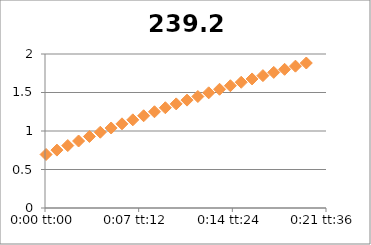
| Category | 239.2 |
|---|---|
| 5.78703703703704e-05 | 0.695 |
| 0.000636574074074074 | 0.752 |
| 0.00121527777777778 | 0.811 |
| 0.00179398148148148 | 0.87 |
| 0.00237268518518518 | 0.929 |
| 0.00295138888888889 | 0.984 |
| 0.00353009259259259 | 1.039 |
| 0.0041087962962963 | 1.093 |
| 0.0046875 | 1.145 |
| 0.0052662037037037 | 1.198 |
| 0.00584490740740741 | 1.25 |
| 0.00642361111111111 | 1.302 |
| 0.00700231481481481 | 1.352 |
| 0.00758101851851852 | 1.401 |
| 0.00815972222222222 | 1.448 |
| 0.00873842592592592 | 1.496 |
| 0.00931712962962963 | 1.542 |
| 0.00989583333333333 | 1.588 |
| 0.010474537037037 | 1.633 |
| 0.0110532407407407 | 1.676 |
| 0.0116319444444444 | 1.719 |
| 0.0122106481481481 | 1.761 |
| 0.0127893518518518 | 1.801 |
| 0.0133680555555556 | 1.842 |
| 0.0139467592592593 | 1.883 |